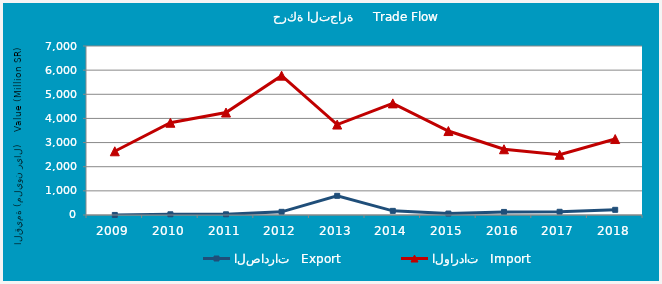
| Category | الصادرات   Export | الواردات   Import |
|---|---|---|
| 2009.0 | 2282485 | 2639220326 |
| 2010.0 | 29665498 | 3820730330 |
| 2011.0 | 28622606 | 4244157419 |
| 2012.0 | 131207639 | 5771975719 |
| 2013.0 | 794349838 | 3746034202 |
| 2014.0 | 171050202 | 4623102601 |
| 2015.0 | 59673564 | 3477221985 |
| 2016.0 | 126968795 | 2723338317 |
| 2017.0 | 133116532 | 2495415084 |
| 2018.0 | 214530129 | 3146213284 |